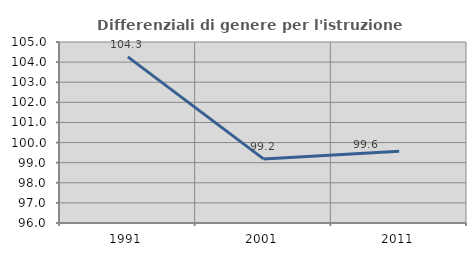
| Category | Differenziali di genere per l'istruzione superiore |
|---|---|
| 1991.0 | 104.261 |
| 2001.0 | 99.188 |
| 2011.0 | 99.565 |